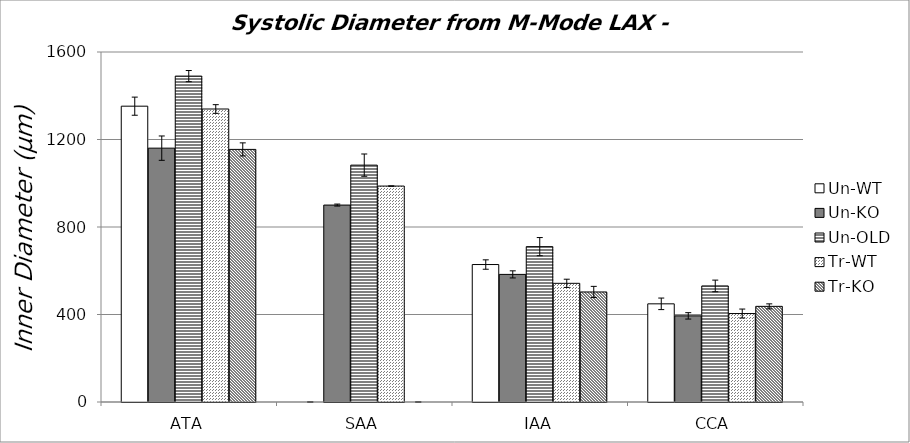
| Category | Un-WT | Un-KO | Un-OLD | Tr-WT | Tr-KO |
|---|---|---|---|---|---|
| 0 | 1352.325 | 1160.468 | 1489.811 | 1339.422 | 1154.738 |
| 1 | 0 | 900.252 | 1082.805 | 987.14 | 0 |
| 2 | 628.4 | 583.351 | 710.23 | 542.526 | 503.065 |
| 3 | 448.784 | 393.751 | 530.584 | 404.413 | 437.263 |